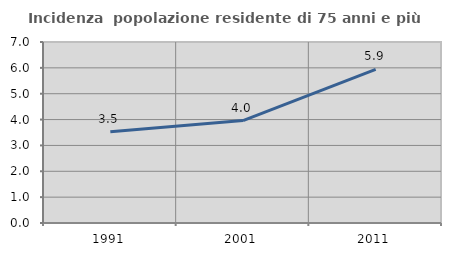
| Category | Incidenza  popolazione residente di 75 anni e più |
|---|---|
| 1991.0 | 3.526 |
| 2001.0 | 3.96 |
| 2011.0 | 5.943 |